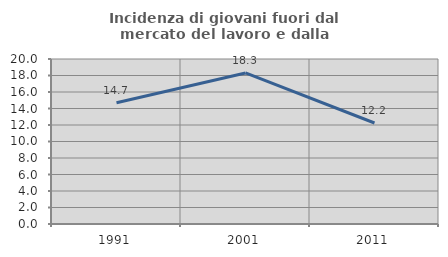
| Category | Incidenza di giovani fuori dal mercato del lavoro e dalla formazione  |
|---|---|
| 1991.0 | 14.69 |
| 2001.0 | 18.306 |
| 2011.0 | 12.243 |